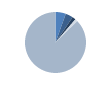
| Category | Series 0 |
|---|---|
| 0 | 69 |
| 1 | 50 |
| 2 | 23 |
| 3 | 17 |
| 4 | 1099 |